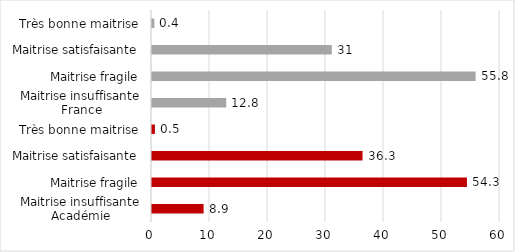
| Category | Series 0 |
|---|---|
| 0 | 8.9 |
| 1 | 54.3 |
| 2 | 36.3 |
| 3 | 0.5 |
| 4 | 12.8 |
| 5 | 55.8 |
| 6 | 31 |
| 7 | 0.4 |